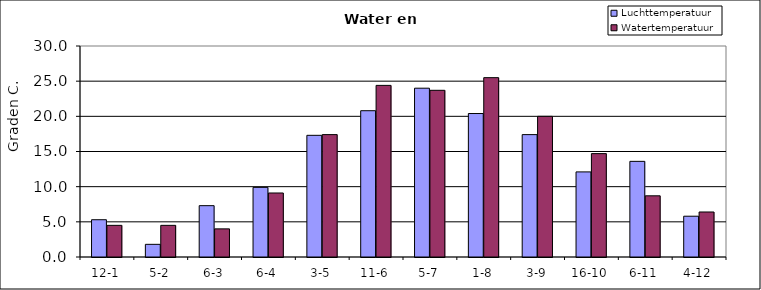
| Category | Luchttemperatuur | Watertemperatuur |
|---|---|---|
| 12-1 | 5.3 | 4.5 |
| 5-2 | 1.8 | 4.5 |
| 6-3 | 7.3 | 4 |
| 6-4 | 9.9 | 9.1 |
| 3-5 | 17.3 | 17.4 |
| 11-6 | 20.8 | 24.4 |
| 5-7 | 24 | 23.7 |
| 1-8 | 20.4 | 25.5 |
| 3-9 | 17.4 | 20 |
| 16-10 | 12.1 | 14.7 |
| 6-11 | 13.6 | 8.7 |
| 4-12 | 5.8 | 6.4 |